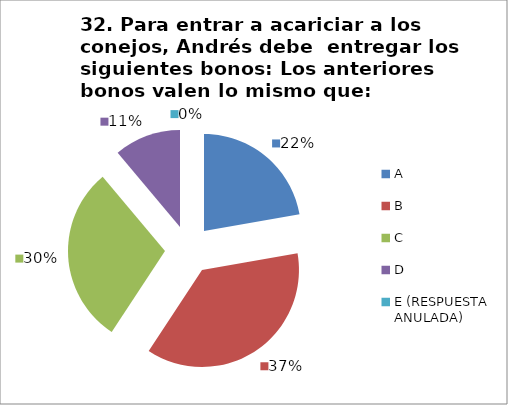
| Category | CANTIDAD DE RESPUESTAS PREGUNTA (32) | PORCENTAJE |
|---|---|---|
| A | 6 | 0.222 |
| B | 10 | 0.37 |
| C | 8 | 0.296 |
| D | 3 | 0.111 |
| E (RESPUESTA ANULADA) | 0 | 0 |